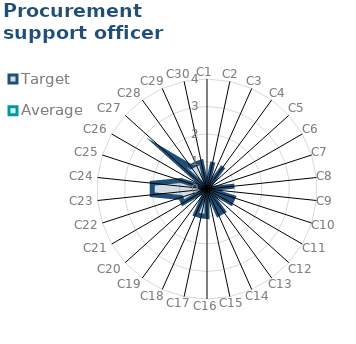
| Category | Target | Average |
|---|---|---|
| C1 | 0 | 0 |
| C2 | 1 | 0 |
| C3 | 0 | 0 |
| C4 | 1 | 0 |
| C5 | 0 | 0 |
| C6 | 0 | 0 |
| C7 | 0 | 0 |
| C8 | 1 | 0 |
| C9 | 0 | 0 |
| C10 | 1 | 0 |
| C11 | 1 | 0 |
| C12 | 0 | 0 |
| C13 | 1 | 0 |
| C14 | 1 | 0 |
| C15 | 0 | 0 |
| C16 | 1 | 0 |
| C17 | 1 | 0 |
| C18 | 1 | 0 |
| C19 | 0 | 0 |
| C20 | 0 | 0 |
| C21 | 1 | 0 |
| C22 | 1 | 0 |
| C23 | 2 | 0 |
| C24 | 2 | 0 |
| C25 | 1 | 0 |
| C26 | 0 | 0 |
| C27 | 2 | 0 |
| C28 | 1 | 0 |
| C29 | 1 | 0 |
| C30 | 1 | 0 |